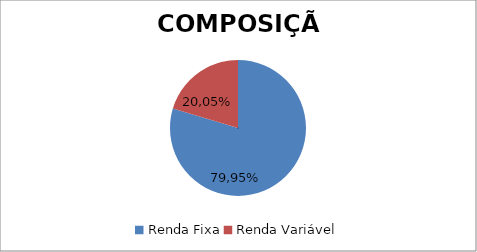
| Category | Series 0 |
|---|---|
| Renda Fixa | 0.796 |
| Renda Variável | 0.204 |